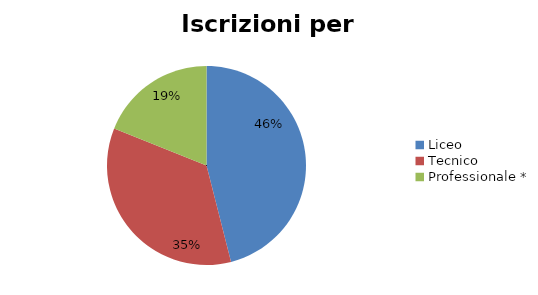
| Category | Series 0 |
|---|---|
| Liceo  | 17929 |
| Tecnico | 13646 |
| Professionale * | 7374 |